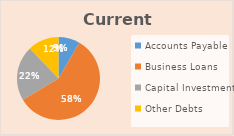
| Category | Series 0 |
|---|---|
| Accounts Payable | 12500 |
| Business Loans | 86500 |
| Capital Investments | 32000 |
| Other Debts | 18000 |